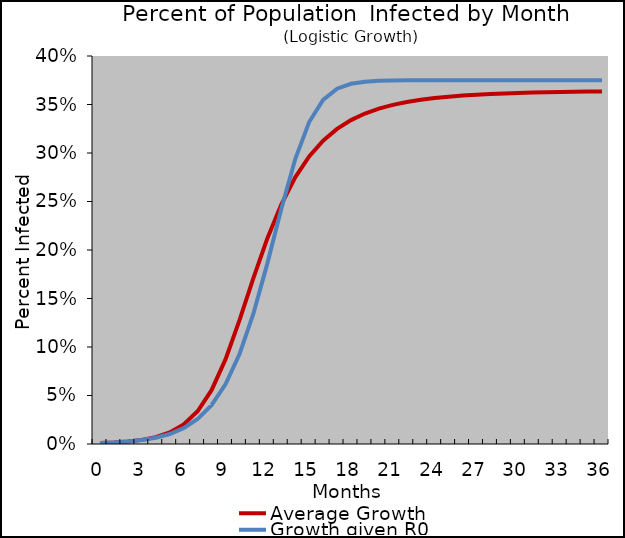
| Category | Average Growth | Growth given R0 |
|---|---|---|
| 0.0 | 0.001 | 0.001 |
| 1.0 | 0.002 | 0.002 |
| 2.0 | 0.003 | 0.003 |
| 3.0 | 0.004 | 0.004 |
| 4.0 | 0.007 | 0.006 |
| 5.0 | 0.012 | 0.01 |
| 6.0 | 0.02 | 0.016 |
| 7.0 | 0.034 | 0.026 |
| 8.0 | 0.055 | 0.04 |
| 9.0 | 0.087 | 0.062 |
| 10.0 | 0.127 | 0.092 |
| 11.0 | 0.171 | 0.134 |
| 12.0 | 0.212 | 0.186 |
| 13.0 | 0.247 | 0.242 |
| 14.0 | 0.275 | 0.294 |
| 15.0 | 0.296 | 0.332 |
| 16.0 | 0.313 | 0.355 |
| 17.0 | 0.325 | 0.366 |
| 18.0 | 0.334 | 0.371 |
| 19.0 | 0.341 | 0.374 |
| 20.0 | 0.346 | 0.374 |
| 21.0 | 0.35 | 0.375 |
| 22.0 | 0.353 | 0.375 |
| 23.0 | 0.355 | 0.375 |
| 24.0 | 0.357 | 0.375 |
| 25.0 | 0.358 | 0.375 |
| 26.0 | 0.359 | 0.375 |
| 27.0 | 0.36 | 0.375 |
| 28.0 | 0.361 | 0.375 |
| 29.0 | 0.361 | 0.375 |
| 30.0 | 0.362 | 0.375 |
| 31.0 | 0.362 | 0.375 |
| 32.0 | 0.363 | 0.375 |
| 33.0 | 0.363 | 0.375 |
| 34.0 | 0.363 | 0.375 |
| 35.0 | 0.363 | 0.375 |
| 36.0 | 0.363 | 0.375 |